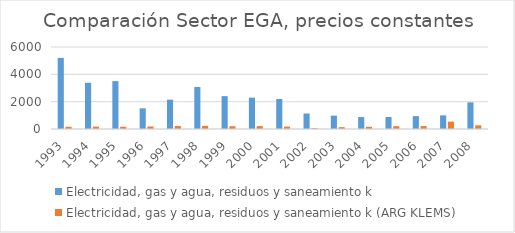
| Category | Electricidad, gas y agua, residuos y saneamiento k | Electricidad, gas y agua, residuos y saneamiento k (ARG KLEMS) |
|---|---|---|
| 1993.0 | 5204.484 | 161.643 |
| 1994.0 | 3384.364 | 174.795 |
| 1995.0 | 3504.804 | 164.754 |
| 1996.0 | 1515.006 | 182.889 |
| 1997.0 | 2146.929 | 214.996 |
| 1998.0 | 3073.52 | 227.516 |
| 1999.0 | 2406.027 | 201.255 |
| 2000.0 | 2294.358 | 211.393 |
| 2001.0 | 2196.269 | 177.287 |
| 2002.0 | 1135.006 | 61.703 |
| 2003.0 | 978.42 | 135.04 |
| 2004.0 | 873.846 | 160.1 |
| 2005.0 | 877.467 | 204.938 |
| 2006.0 | 943.145 | 213.175 |
| 2007.0 | 996.695 | 539.318 |
| 2008.0 | 1949.917 | 268.686 |